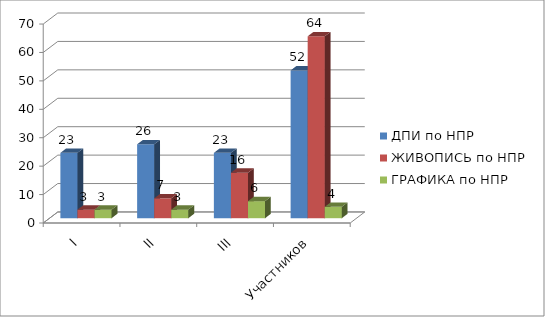
| Category | ДПИ по НПР | ЖИВОПИСЬ по НПР | ГРАФИКА по НПР |
|---|---|---|---|
| I | 23 | 3 | 3 |
| II | 26 | 7 | 3 |
| III | 23 | 16 | 6 |
| Участников | 52 | 64 | 4 |